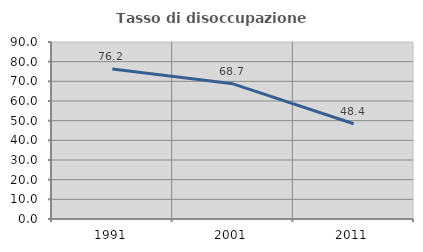
| Category | Tasso di disoccupazione giovanile  |
|---|---|
| 1991.0 | 76.232 |
| 2001.0 | 68.715 |
| 2011.0 | 48.421 |